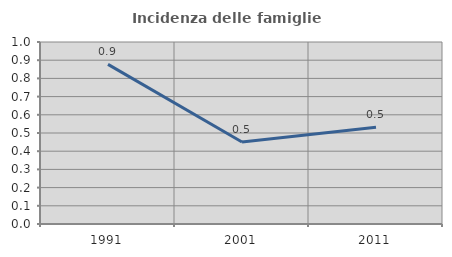
| Category | Incidenza delle famiglie numerose |
|---|---|
| 1991.0 | 0.877 |
| 2001.0 | 0.45 |
| 2011.0 | 0.532 |